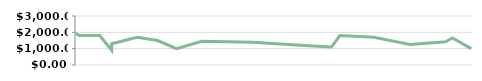
| Category | REVENUE |
|---|---|
| 2013-04-23 | 1950 |
| 2013-04-25 | 1800 |
| 2013-05-07 | 1800 |
| 2013-05-14 | 900 |
| 2013-05-14 | 1300 |
| 2013-05-29 | 1700 |
| 2013-06-10 | 1500 |
| 2013-06-21 | 1000 |
| 2013-07-06 | 1450 |
| 2013-08-05 | 1400 |
| 2013-08-19 | 1300 |
| 2013-09-04 | 1200 |
| 2013-09-20 | 1100 |
| 2013-09-25 | 1800 |
| 2013-10-15 | 1700 |
| 2013-11-05 | 1250 |
| 2013-11-26 | 1425 |
| 2013-11-30 | 1650 |
| 2013-12-11 | 1000 |